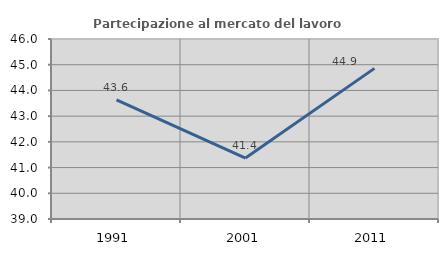
| Category | Partecipazione al mercato del lavoro  femminile |
|---|---|
| 1991.0 | 43.628 |
| 2001.0 | 41.37 |
| 2011.0 | 44.858 |